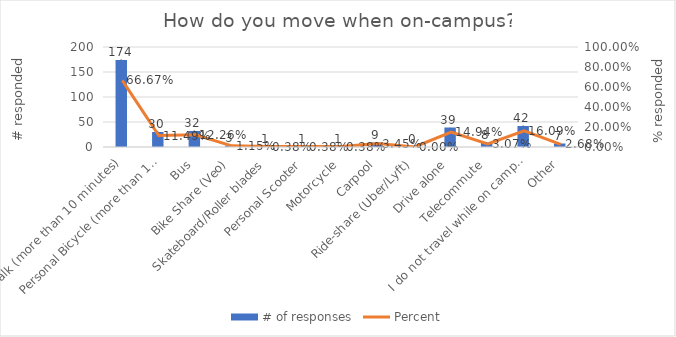
| Category | # of responses |
|---|---|
| Walk (more than 10 minutes) | 174 |
| Personal Bicycle (more than 10 minutes) | 30 |
| Bus | 32 |
| Bike Share (Veo) | 3 |
| Skateboard/Roller blades | 1 |
| Personal Scooter | 1 |
| Motorcycle | 1 |
| Carpool | 9 |
| Ride-share (Uber/Lyft) | 0 |
| Drive alone | 39 |
| Telecommute | 8 |
| I do not travel while on campus (I just go back to my place of residence after work/class/lab) | 42 |
| Other | 7 |